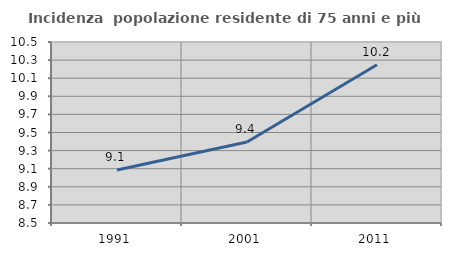
| Category | Incidenza  popolazione residente di 75 anni e più |
|---|---|
| 1991.0 | 9.087 |
| 2001.0 | 9.394 |
| 2011.0 | 10.248 |